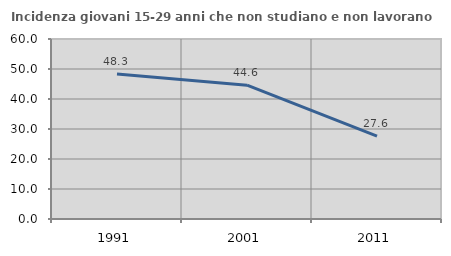
| Category | Incidenza giovani 15-29 anni che non studiano e non lavorano  |
|---|---|
| 1991.0 | 48.333 |
| 2001.0 | 44.621 |
| 2011.0 | 27.623 |